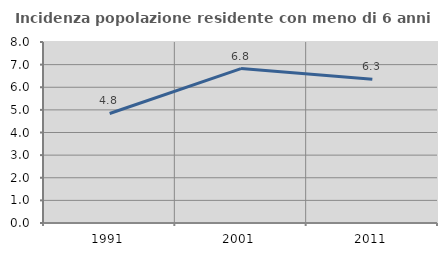
| Category | Incidenza popolazione residente con meno di 6 anni |
|---|---|
| 1991.0 | 4.842 |
| 2001.0 | 6.825 |
| 2011.0 | 6.349 |